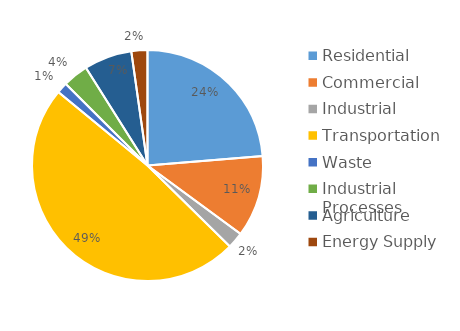
| Category | MTCO2e* |
|---|---|
| Residential | 12818 |
| Commercial | 6159 |
| Industrial | 1227 |
| Transportation | 26285 |
| Waste | 825 |
| Industrial Processes | 1929 |
| Agriculture | 3622 |
| Energy Supply | 1217 |